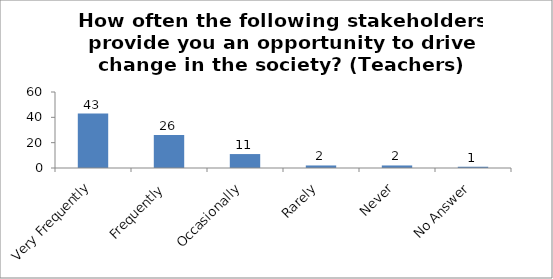
| Category | How often the following stakeholders provide you an opportunity to drive change in the society? (Teachers) |
|---|---|
| Very Frequently | 43 |
| Frequently | 26 |
| Occasionally | 11 |
| Rarely | 2 |
| Never | 2 |
| No Answer | 1 |